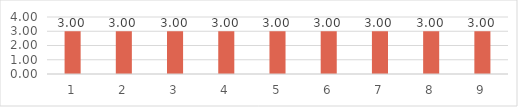
| Category | Series 0 |
|---|---|
| 0 | 3 |
| 1 | 3 |
| 2 | 3 |
| 3 | 3 |
| 4 | 3 |
| 5 | 3 |
| 6 | 3 |
| 7 | 3 |
| 8 | 3 |